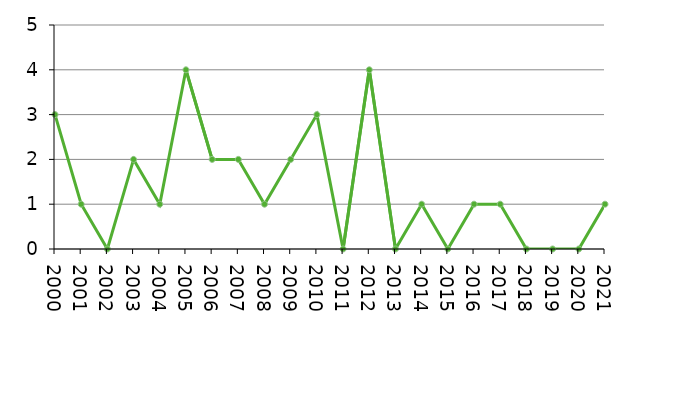
| Category | Avlidna |
|---|---|
| 2000 | 3 |
| 2001 | 1 |
| 2002 | 0 |
| 2003 | 2 |
| 2004 | 1 |
| 2005 | 4 |
| 2006 | 2 |
| 2007 | 2 |
| 2008 | 1 |
| 2009 | 2 |
| 2010 | 3 |
| 2011 | 0 |
| 2012 | 4 |
| 2013 | 0 |
| 2014 | 1 |
| 2015 | 0 |
| 2016 | 1 |
| 2017 | 1 |
| 2018 | 0 |
| 2019 | 0 |
| 2020 | 0 |
| 2021 | 1 |